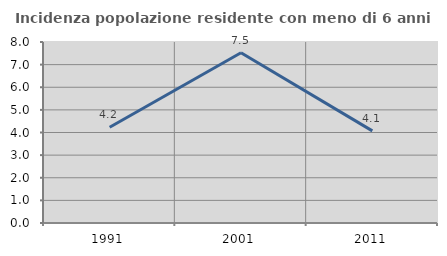
| Category | Incidenza popolazione residente con meno di 6 anni |
|---|---|
| 1991.0 | 4.233 |
| 2001.0 | 7.522 |
| 2011.0 | 4.072 |